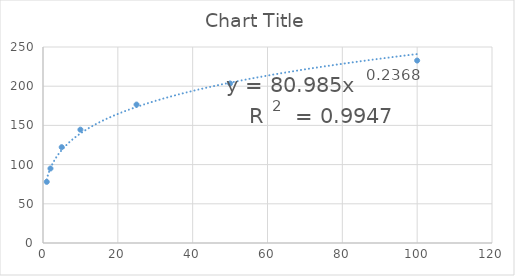
| Category | Series 0 |
|---|---|
| 1.0 | 77.996 |
| 2.0 | 95.018 |
| 5.0 | 122.203 |
| 10.0 | 144.56 |
| 25.0 | 176.572 |
| 50.0 | 203.502 |
| 100.0 | 232.719 |